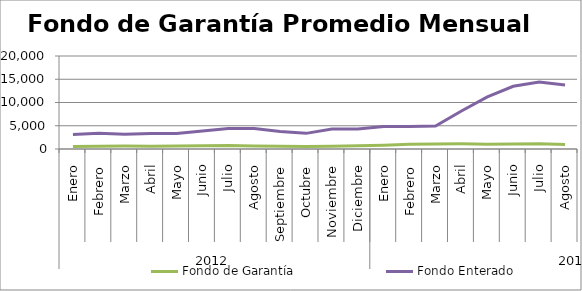
| Category | Fondo de Garantía | Fondo Enterado |
|---|---|---|
| 0 | 560.173 | 3141.641 |
| 1 | 575.916 | 3362.648 |
| 2 | 622.075 | 3154.118 |
| 3 | 612.299 | 3348.058 |
| 4 | 654.277 | 3308.859 |
| 5 | 675.965 | 3850.375 |
| 6 | 729.97 | 4400.539 |
| 7 | 649.095 | 4383.327 |
| 8 | 606.03 | 3757.632 |
| 9 | 525.314 | 3362.932 |
| 10 | 591.646 | 4285.609 |
| 11 | 703.403 | 4296.87 |
| 12 | 823.344 | 4842.786 |
| 13 | 1008.855 | 4845.136 |
| 14 | 1091.101 | 4938.365 |
| 15 | 1128.09 | 8179.666 |
| 16 | 1047.818 | 11202.213 |
| 17 | 1079.154 | 13493.433 |
| 18 | 1130.244 | 14387.844 |
| 19 | 950.791 | 13769.803 |